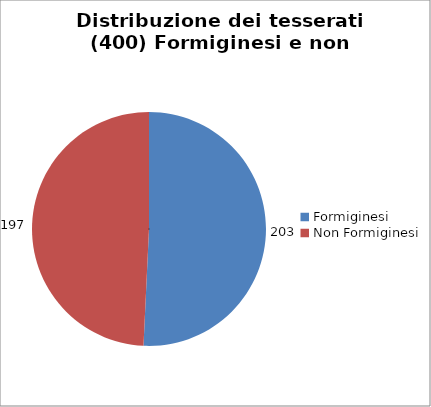
| Category | Nr. Tesserati |
|---|---|
| Formiginesi | 203 |
| Non Formiginesi | 197 |